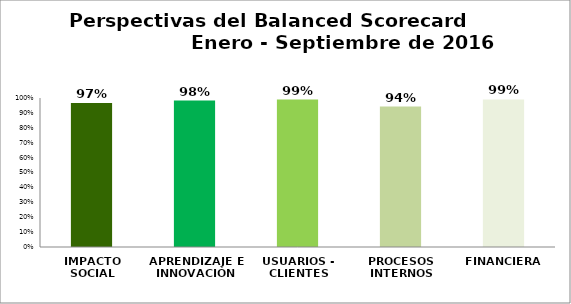
| Category | Series 0 |
|---|---|
| IMPACTO SOCIAL | 0.967 |
| APRENDIZAJE E INNOVACIÓN | 0.983 |
| USUARIOS - CLIENTES | 0.99 |
| PROCESOS INTERNOS | 0.942 |
| FINANCIERA | 0.99 |